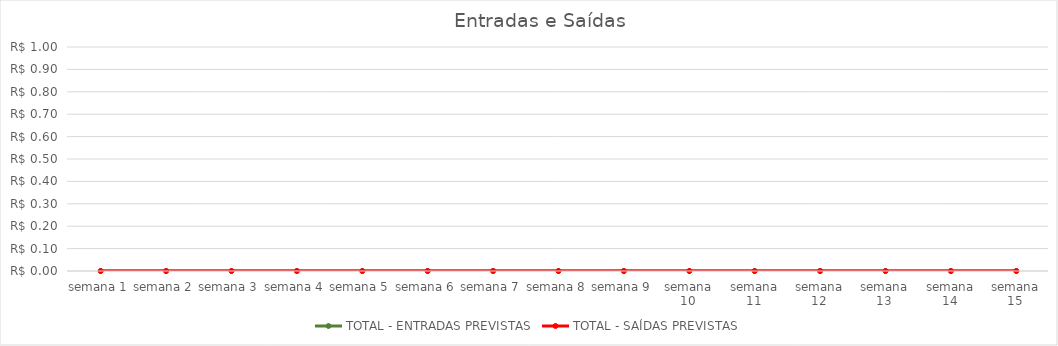
| Category | TOTAL - ENTRADAS PREVISTAS | TOTAL - SAÍDAS PREVISTAS |
|---|---|---|
| semana 1 | 0 | 0 |
| semana 2 | 0 | 0 |
| semana 3 | 0 | 0 |
| semana 4 | 0 | 0 |
| semana 5 | 0 | 0 |
| semana 6 | 0 | 0 |
| semana 7 | 0 | 0 |
| semana 8 | 0 | 0 |
| semana 9 | 0 | 0 |
| semana 10 | 0 | 0 |
| semana 11 | 0 | 0 |
| semana 12 | 0 | 0 |
| semana 13 | 0 | 0 |
| semana 14 | 0 | 0 |
| semana 15 | 0 | 0 |